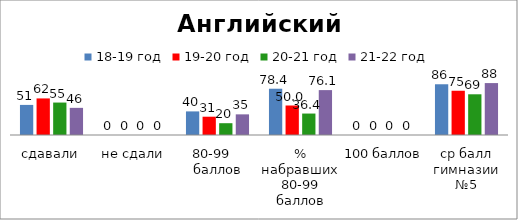
| Category | 18-19 год | 19-20 год | 20-21 год | 21-22 год |
|---|---|---|---|---|
| сдавали | 51 | 62 | 55 | 46 |
| не сдали | 0 | 0 | 0 | 0 |
| 80-99    баллов | 40 | 31 | 20 | 35 |
| % набравших 80-99 баллов | 78.431 | 50 | 36.364 | 76.087 |
| 100 баллов | 0 | 0 | 0 | 0 |
| ср балл гимназии №5 | 86 | 75 | 69 | 88 |